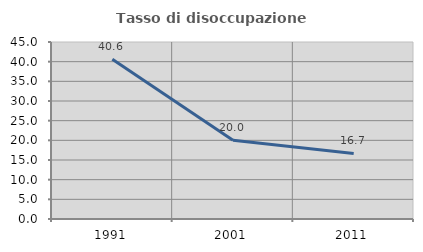
| Category | Tasso di disoccupazione giovanile  |
|---|---|
| 1991.0 | 40.625 |
| 2001.0 | 20 |
| 2011.0 | 16.667 |